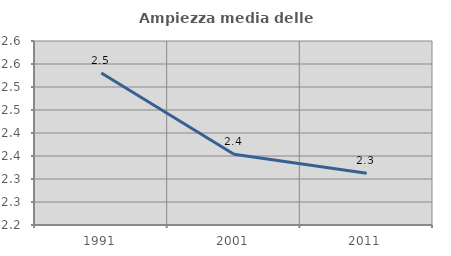
| Category | Ampiezza media delle famiglie |
|---|---|
| 1991.0 | 2.53 |
| 2001.0 | 2.354 |
| 2011.0 | 2.312 |